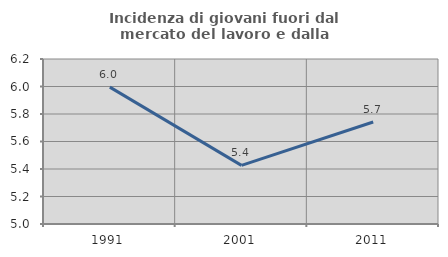
| Category | Incidenza di giovani fuori dal mercato del lavoro e dalla formazione  |
|---|---|
| 1991.0 | 5.995 |
| 2001.0 | 5.426 |
| 2011.0 | 5.742 |